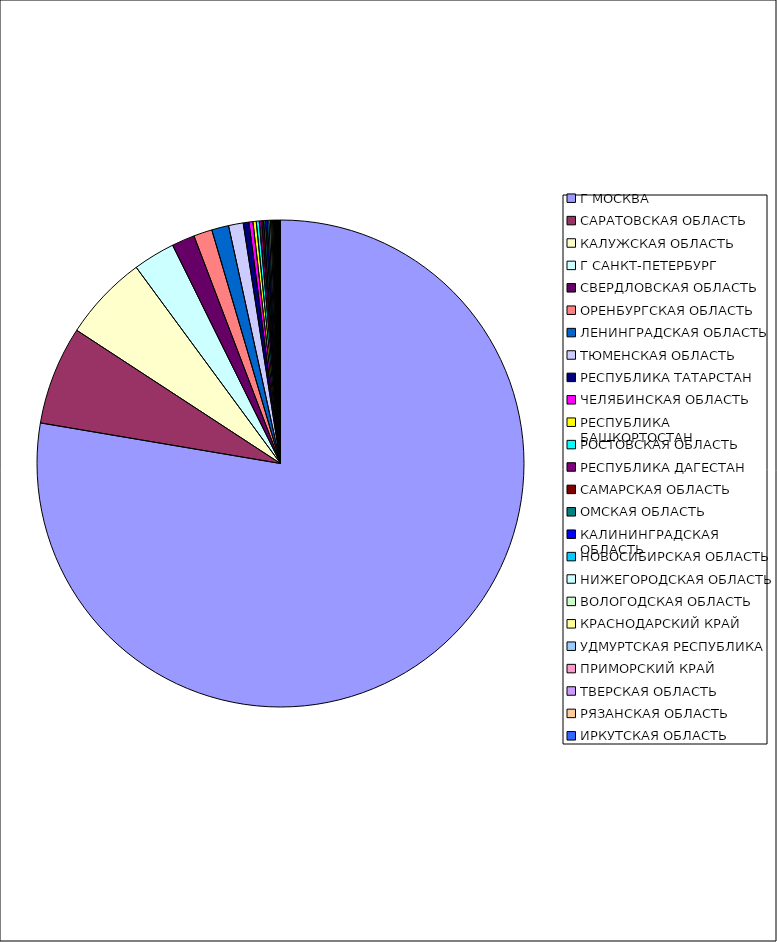
| Category | Оборот |
|---|---|
| Г МОСКВА | 0.776 |
| САРАТОВСКАЯ ОБЛАСТЬ | 0.065 |
| КАЛУЖСКАЯ ОБЛАСТЬ | 0.057 |
| Г САНКТ-ПЕТЕРБУРГ | 0.028 |
| СВЕРДЛОВСКАЯ ОБЛАСТЬ | 0.015 |
| ОРЕНБУРГСКАЯ ОБЛАСТЬ | 0.012 |
| ЛЕНИНГРАДСКАЯ ОБЛАСТЬ | 0.011 |
| ТЮМЕНСКАЯ ОБЛАСТЬ | 0.01 |
| РЕСПУБЛИКА ТАТАРСТАН | 0.004 |
| ЧЕЛЯБИНСКАЯ ОБЛАСТЬ | 0.003 |
| РЕСПУБЛИКА БАШКОРТОСТАН | 0.002 |
| РОСТОВСКАЯ ОБЛАСТЬ | 0.002 |
| РЕСПУБЛИКА ДАГЕСТАН | 0.002 |
| САМАРСКАЯ ОБЛАСТЬ | 0.001 |
| ОМСКАЯ ОБЛАСТЬ | 0.001 |
| КАЛИНИНГРАДСКАЯ ОБЛАСТЬ | 0.001 |
| НОВОСИБИРСКАЯ ОБЛАСТЬ | 0.001 |
| НИЖЕГОРОДСКАЯ ОБЛАСТЬ | 0.001 |
| ВОЛОГОДСКАЯ ОБЛАСТЬ | 0.001 |
| КРАСНОДАРСКИЙ КРАЙ | 0.001 |
| УДМУРТСКАЯ РЕСПУБЛИКА | 0.001 |
| ПРИМОРСКИЙ КРАЙ | 0 |
| ТВЕРСКАЯ ОБЛАСТЬ | 0 |
| РЯЗАНСКАЯ ОБЛАСТЬ | 0 |
| ИРКУТСКАЯ ОБЛАСТЬ | 0 |
| ПСКОВСКАЯ ОБЛАСТЬ | 0 |
| КИРОВСКАЯ ОБЛАСТЬ | 0 |
| РЕСПУБЛИКА МОРДОВИЯ | 0 |
| ПЕРМСКИЙ КРАЙ | 0 |
| ЛИПЕЦКАЯ ОБЛАСТЬ | 0 |
| ИВАНОВСКАЯ ОБЛАСТЬ | 0 |
| БЕЛГОРОДСКАЯ ОБЛАСТЬ | 0 |
| РЕСПУБЛИКА САХА(ЯКУТИЯ) | 0 |
| ТУЛЬСКАЯ ОБЛАСТЬ | 0 |
| ЯРОСЛАВСКАЯ ОБЛАСТЬ | 0 |
| КУРСКАЯ ОБЛАСТЬ | 0 |
| СТАВРОПОЛЬСКИЙ КРАЙ | 0 |
| АЛТАЙСКИЙ КРАЙ | 0 |
| ВОЛГОГРАДСКАЯ ОБЛАСТЬ | 0 |
| АРХАНГЕЛЬСКАЯ ОБЛАСТЬ | 0 |
| РЕСПУБЛИКА СЕВЕРНАЯ ОСЕТИЯ-АЛАНИЯ | 0 |
| МОСКОВСКАЯ ОБЛАСТЬ | 0 |
| КЕМЕРОВСКАЯ ОБЛАСТЬ | 0 |
| СМОЛЕНСКАЯ ОБЛАСТЬ | 0 |
| КАБАРДИНО-БАЛКАРСКАЯ РЕСПУБЛИКА | 0 |
| РЕСПУБЛИКА КОМИ | 0 |